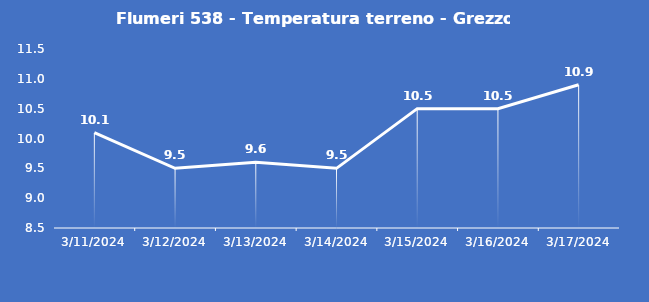
| Category | Flumeri 538 - Temperatura terreno - Grezzo (°C) |
|---|---|
| 3/11/24 | 10.1 |
| 3/12/24 | 9.5 |
| 3/13/24 | 9.6 |
| 3/14/24 | 9.5 |
| 3/15/24 | 10.5 |
| 3/16/24 | 10.5 |
| 3/17/24 | 10.9 |